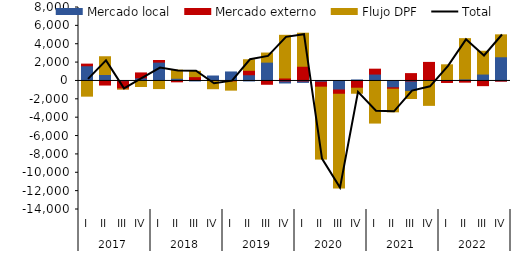
| Category | Mercado local | Mercado externo | Flujo DPF |
|---|---|---|---|
| 0 | 1655.56 | 177.301 | -1656.335 |
| 1 | 702.963 | -446.607 | 1934.674 |
| 2 | -75.967 | -785.675 | -4.992 |
| 3 | 336.364 | 538.061 | -605.093 |
| 4 | 2050.669 | 176.974 | -829.841 |
| 5 | 292.511 | -95.98 | 881.23 |
| 6 | 159.72 | 307.969 | 585.157 |
| 7 | 538.689 | -58.267 | -786.922 |
| 8 | 979.361 | -101.205 | -899.262 |
| 9 | 676.837 | 480.395 | 1151.583 |
| 10 | 2049.543 | -361.98 | 989.81 |
| 11 | -220.353 | 323.265 | 4647.815 |
| 12 | -156.393 | 1599.803 | 3600.098 |
| 13 | -133.868 | -543.113 | -7832.221 |
| 14 | -984.868 | -467.801 | -10213.589 |
| 15 | 107.247 | -790.064 | -547.934 |
| 16 | 748.563 | 534.06 | -4586.876 |
| 17 | -745.582 | -153.332 | -2462.467 |
| 18 | -1140.74 | 799.705 | -768.219 |
| 19 | 115.969 | 1903.896 | -2659.049 |
| 20 | 157.508 | -165.05 | 1601.041 |
| 21 | 220.698 | -132.172 | 4387.678 |
| 22 | 752.382 | -512.524 | 2481.991 |
| 23 | 2634.535 | -17.768 | 2388.564 |